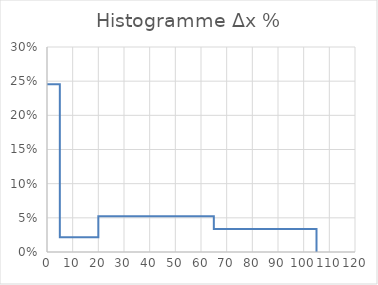
| Category | Histogramme |
|---|---|
| 0.0 | 0.245 |
| 5.0 | 0.245 |
| 5.0 | 0.022 |
| 20.0 | 0.022 |
| 20.0 | 0.052 |
| 65.0 | 0.052 |
| 65.0 | 0.034 |
| 105.0 | 0.034 |
| 105.0 | 0.034 |
| 105.0 | 0 |